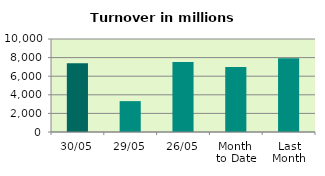
| Category | Series 0 |
|---|---|
| 30/05 | 7381.147 |
| 29/05 | 3318.725 |
| 26/05 | 7534.743 |
| Month 
to Date | 6996.642 |
| Last
Month | 7939.051 |